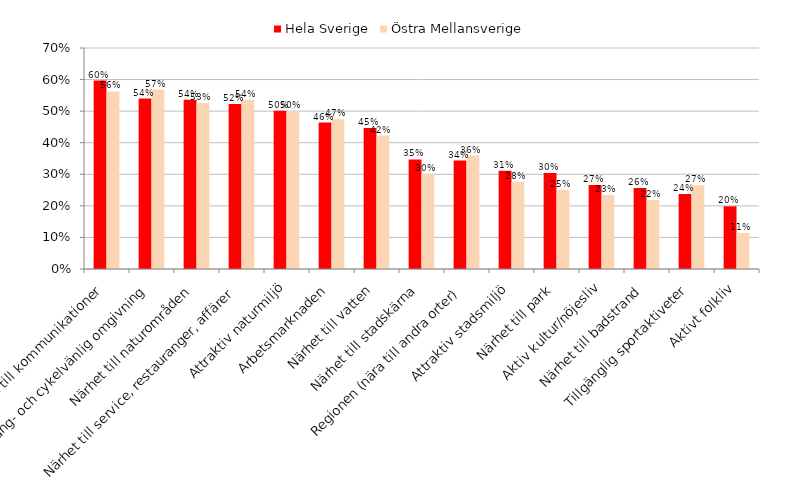
| Category | Hela Sverige | Östra Mellansverige |
|---|---|---|
| Närhet till kommunikationer | 0.597 | 0.562 |
| Gång- och cykelvänlig omgivning | 0.54 | 0.568 |
| Närhet till naturområden | 0.536 | 0.526 |
| Närhet till service, restauranger, affärer | 0.523 | 0.536 |
| Attraktiv naturmiljö | 0.501 | 0.5 |
| Arbetsmarknaden | 0.464 | 0.474 |
| Närhet till vatten | 0.446 | 0.422 |
| Närhet till stadskärna | 0.347 | 0.302 |
| Regionen (nära till andra orter) | 0.343 | 0.359 |
|  Attraktiv stadsmiljö | 0.311 | 0.276 |
| Närhet till park | 0.304 | 0.25 |
| Aktiv kultur/nöjesliv | 0.266 | 0.234 |
| Närhet till badstrand | 0.257 | 0.219 |
| Tillgänglig sportaktiveter | 0.237 | 0.266 |
| Aktivt folkliv | 0.199 | 0.115 |